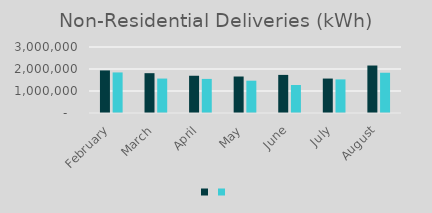
| Category | Series 1 | Series 0 |
|---|---|---|
| February | 1935461 | 1843770 |
| March | 1810164 | 1565360 |
| April | 1693101 | 1549578 |
| May | 1658799 | 1468467 |
| June | 1732026 | 1273660 |
| July | 1565715 | 1527956 |
| August | 2157982 | 1829758 |